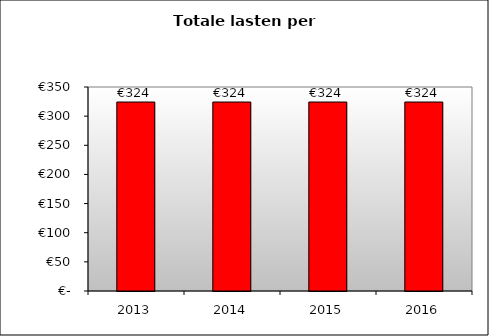
| Category | Series 0 |
|---|---|
| 2013.0 | 324.237 |
| 2014.0 | 324.237 |
| 2015.0 | 324.237 |
| 2016.0 | 324.237 |